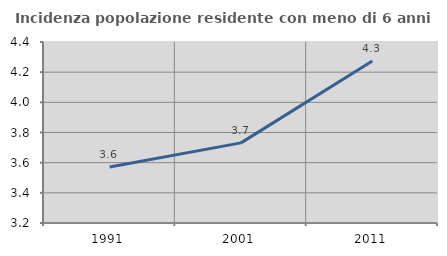
| Category | Incidenza popolazione residente con meno di 6 anni |
|---|---|
| 1991.0 | 3.571 |
| 2001.0 | 3.731 |
| 2011.0 | 4.274 |